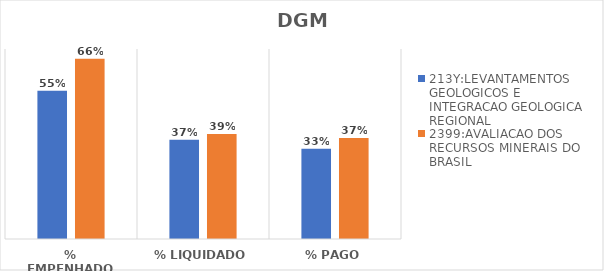
| Category | 213Y:LEVANTAMENTOS GEOLOGICOS E INTEGRACAO GEOLOGICA REGIONAL | 2399:AVALIACAO DOS RECURSOS MINERAIS DO BRASIL |
|---|---|---|
| % EMPENHADO | 0.546 | 0.664 |
| % LIQUIDADO | 0.365 | 0.387 |
| % PAGO | 0.333 | 0.372 |